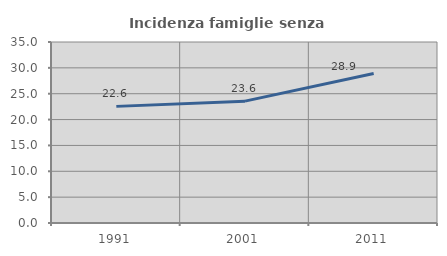
| Category | Incidenza famiglie senza nuclei |
|---|---|
| 1991.0 | 22.552 |
| 2001.0 | 23.566 |
| 2011.0 | 28.893 |